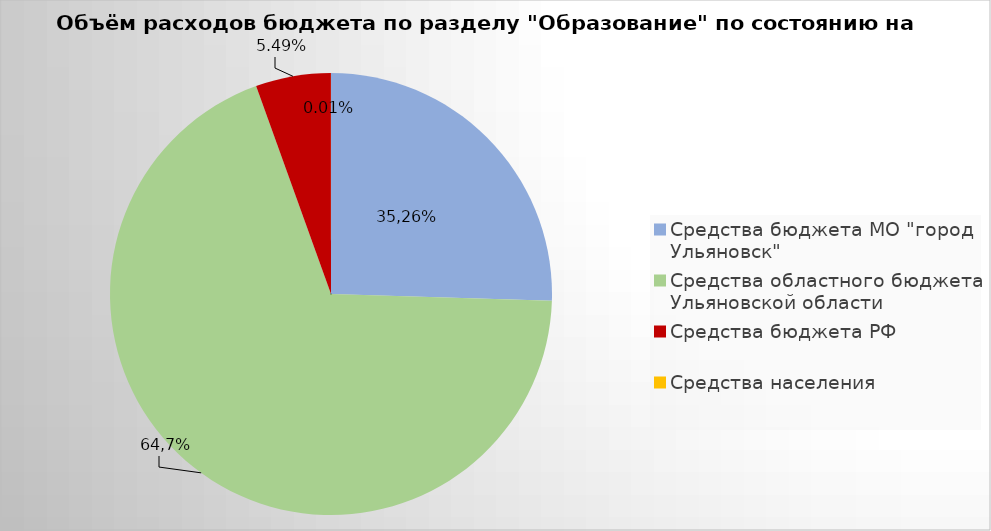
| Category | Series 0 |
|---|---|
| Средства бюджета МО "город Ульяновск" | 2220060.24 |
| Средства областного бюджета Ульяновской области | 6010978.47 |
| Средства бюджета РФ | 478608.6 |
| Средства населения | 558.01 |